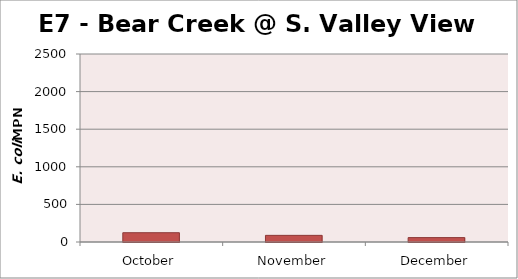
| Category | Series 0 |
|---|---|
| October | 123.6 |
| November | 88.2 |
| December | 58.3 |